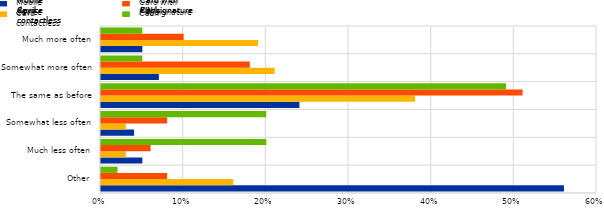
| Category | Mobile device | Card contactless | Card with PIN/signature | Cash |
|---|---|---|---|---|
| Other | 0.56 | 0.16 | 0.08 | 0.02 |
| Much less often | 0.05 | 0.03 | 0.06 | 0.2 |
| Somewhat less often | 0.04 | 0.03 | 0.08 | 0.2 |
| The same as before | 0.24 | 0.38 | 0.51 | 0.49 |
| Somewhat more often | 0.07 | 0.21 | 0.18 | 0.05 |
| Much more often | 0.05 | 0.19 | 0.1 | 0.05 |